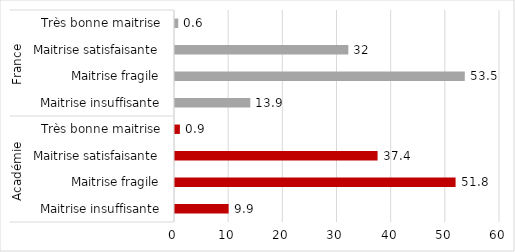
| Category | Series 0 |
|---|---|
| 0 | 9.9 |
| 1 | 51.8 |
| 2 | 37.4 |
| 3 | 0.9 |
| 4 | 13.9 |
| 5 | 53.5 |
| 6 | 32 |
| 7 | 0.6 |